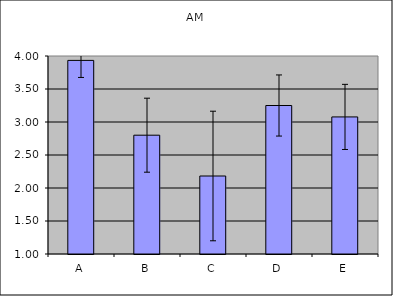
| Category | AM |
|---|---|
| A | 3.933 |
| B | 2.8 |
| C | 2.182 |
| D | 3.25 |
| E | 3.077 |